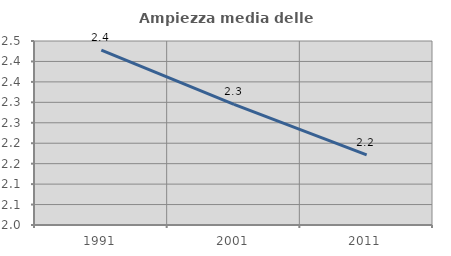
| Category | Ampiezza media delle famiglie |
|---|---|
| 1991.0 | 2.428 |
| 2001.0 | 2.295 |
| 2011.0 | 2.172 |